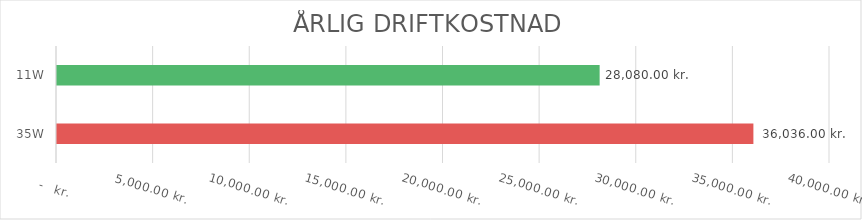
| Category | ÅRLIG ENERGIKOSTNAD KR./KWH  |
|---|---|
| 35W | 36036 |
| 11W | 28080 |